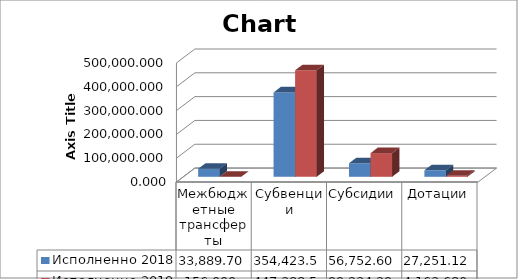
| Category | Исполненно 2018 | Исполненно 2019 |
|---|---|---|
| Межбюджетные трансферты | 33889.7 | 156 |
| Субвенции | 354423.557 | 447388.51 |
| Субсидии | 56752.605 | 99234.29 |
| Дотации | 27251.129 | 4163.68 |